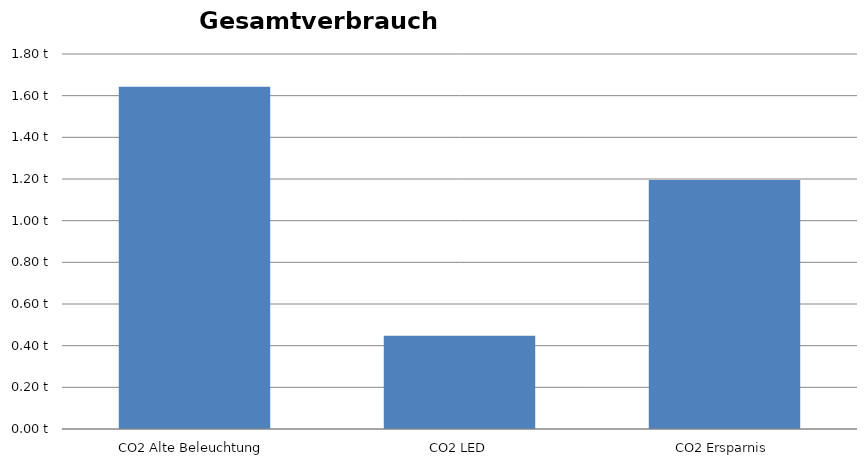
| Category | Series 0 |
|---|---|
| CO2 Alte Beleuchtung | 1.642 |
| CO2 LED | 0.447 |
| CO2 Ersparnis | 1.195 |